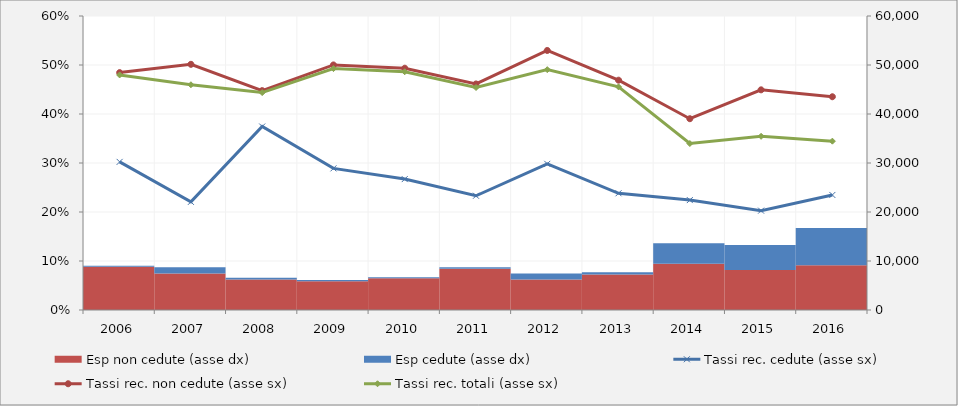
| Category | Esp non cedute (asse dx)  | Esp cedute (asse dx) |
|---|---|---|
| 2006.0 | 8803040402 | 236068123 |
| 2007.0 | 7442770518 | 1298764521 |
| 2008.0 | 6225493473 | 354965552 |
| 2009.0 | 5892617853 | 216283928 |
| 2010.0 | 6454267206 | 212601734 |
| 2011.0 | 8441794414 | 276187901 |
| 2012.0 | 6206683948 | 1265786059 |
| 2013.0 | 7228959124 | 454084164 |
| 2014.0 | 9462846090 | 4149678117 |
| 2015.0 | 8157372643 | 5100781018 |
| 2016.0 | 9154968848 | 7557258123 |